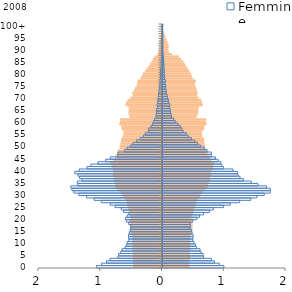
| Category | Italiani | Series 1 | Series 2 | Femmine |
|---|---|---|---|---|
| 0 | -0.46 | 0.434 | -1.063 | 0.994 |
| 1 | -0.463 | 0.436 | -0.978 | 0.919 |
| 2 | -0.464 | 0.436 | -0.899 | 0.842 |
| 3 | -0.471 | 0.447 | -0.842 | 0.792 |
| 4 | -0.471 | 0.446 | -0.714 | 0.666 |
| 5 | -0.466 | 0.442 | -0.703 | 0.658 |
| 6 | -0.468 | 0.443 | -0.668 | 0.625 |
| 7 | -0.477 | 0.45 | -0.65 | 0.607 |
| 8 | -0.472 | 0.448 | -0.598 | 0.554 |
| 9 | -0.472 | 0.445 | -0.572 | 0.533 |
| 10 | -0.47 | 0.445 | -0.565 | 0.511 |
| 11 | -0.474 | 0.448 | -0.536 | 0.492 |
| 12 | -0.473 | 0.447 | -0.539 | 0.491 |
| 13 | -0.478 | 0.452 | -0.543 | 0.497 |
| 14 | -0.49 | 0.465 | -0.53 | 0.478 |
| 15 | -0.51 | 0.485 | -0.514 | 0.472 |
| 16 | -0.51 | 0.483 | -0.504 | 0.447 |
| 17 | -0.514 | 0.488 | -0.504 | 0.451 |
| 18 | -0.507 | 0.483 | -0.54 | 0.445 |
| 19 | -0.515 | 0.487 | -0.581 | 0.492 |
| 20 | -0.497 | 0.471 | -0.59 | 0.558 |
| 21 | -0.501 | 0.477 | -0.565 | 0.602 |
| 22 | -0.517 | 0.496 | -0.538 | 0.665 |
| 23 | -0.524 | 0.503 | -0.622 | 0.76 |
| 24 | -0.537 | 0.514 | -0.659 | 0.822 |
| 25 | -0.553 | 0.533 | -0.761 | 0.99 |
| 26 | -0.557 | 0.539 | -0.84 | 1.096 |
| 27 | -0.569 | 0.55 | -0.985 | 1.249 |
| 28 | -0.588 | 0.571 | -1.101 | 1.431 |
| 29 | -0.622 | 0.605 | -1.223 | 1.527 |
| 30 | -0.647 | 0.628 | -1.346 | 1.649 |
| 31 | -0.682 | 0.66 | -1.428 | 1.747 |
| 32 | -0.72 | 0.696 | -1.459 | 1.747 |
| 33 | -0.754 | 0.73 | -1.477 | 1.684 |
| 34 | -0.751 | 0.738 | -1.364 | 1.546 |
| 35 | -0.758 | 0.752 | -1.371 | 1.438 |
| 36 | -0.773 | 0.773 | -1.295 | 1.31 |
| 37 | -0.765 | 0.768 | -1.335 | 1.256 |
| 38 | -0.789 | 0.796 | -1.36 | 1.222 |
| 39 | -0.777 | 0.788 | -1.413 | 1.214 |
| 40 | -0.786 | 0.798 | -1.339 | 1.142 |
| 41 | -0.81 | 0.822 | -1.216 | 0.989 |
| 42 | -0.812 | 0.823 | -1.152 | 0.963 |
| 43 | -0.829 | 0.836 | -1.039 | 0.944 |
| 44 | -0.78 | 0.79 | -0.912 | 0.9 |
| 45 | -0.756 | 0.767 | -0.836 | 0.858 |
| 46 | -0.747 | 0.758 | -0.716 | 0.793 |
| 47 | -0.722 | 0.735 | -0.713 | 0.791 |
| 48 | -0.711 | 0.72 | -0.605 | 0.722 |
| 49 | -0.679 | 0.692 | -0.568 | 0.676 |
| 50 | -0.675 | 0.689 | -0.506 | 0.612 |
| 51 | -0.666 | 0.683 | -0.469 | 0.566 |
| 52 | -0.658 | 0.676 | -0.411 | 0.524 |
| 53 | -0.65 | 0.672 | -0.354 | 0.467 |
| 54 | -0.626 | 0.643 | -0.301 | 0.417 |
| 55 | -0.619 | 0.642 | -0.271 | 0.384 |
| 56 | -0.621 | 0.646 | -0.22 | 0.335 |
| 57 | -0.647 | 0.673 | -0.215 | 0.316 |
| 58 | -0.653 | 0.679 | -0.178 | 0.287 |
| 59 | -0.683 | 0.715 | -0.154 | 0.248 |
| 60 | -0.67 | 0.702 | -0.139 | 0.213 |
| 61 | -0.671 | 0.709 | -0.118 | 0.182 |
| 62 | -0.519 | 0.552 | -0.097 | 0.146 |
| 63 | -0.531 | 0.571 | -0.096 | 0.14 |
| 64 | -0.535 | 0.583 | -0.089 | 0.131 |
| 65 | -0.53 | 0.583 | -0.089 | 0.125 |
| 66 | -0.533 | 0.592 | -0.074 | 0.113 |
| 67 | -0.583 | 0.653 | -0.08 | 0.12 |
| 68 | -0.572 | 0.645 | -0.069 | 0.1 |
| 69 | -0.551 | 0.629 | -0.067 | 0.094 |
| 70 | -0.504 | 0.586 | -0.063 | 0.083 |
| 71 | -0.469 | 0.559 | -0.057 | 0.074 |
| 72 | -0.473 | 0.573 | -0.052 | 0.064 |
| 73 | -0.451 | 0.558 | -0.047 | 0.057 |
| 74 | -0.43 | 0.544 | -0.04 | 0.051 |
| 75 | -0.403 | 0.529 | -0.037 | 0.051 |
| 76 | -0.393 | 0.529 | -0.031 | 0.041 |
| 77 | -0.39 | 0.542 | -0.034 | 0.046 |
| 78 | -0.341 | 0.489 | -0.026 | 0.034 |
| 79 | -0.318 | 0.475 | -0.025 | 0.032 |
| 80 | -0.301 | 0.458 | -0.026 | 0.032 |
| 81 | -0.268 | 0.433 | -0.021 | 0.027 |
| 82 | -0.243 | 0.411 | -0.019 | 0.027 |
| 83 | -0.209 | 0.385 | -0.013 | 0.023 |
| 84 | -0.183 | 0.362 | -0.012 | 0.022 |
| 85 | -0.161 | 0.338 | -0.012 | 0.021 |
| 86 | -0.14 | 0.303 | -0.01 | 0.018 |
| 87 | -0.115 | 0.266 | -0.009 | 0.017 |
| 88 | -0.067 | 0.156 | -0.006 | 0.01 |
| 89 | -0.042 | 0.104 | -0.005 | 0.008 |
| 90 | -0.037 | 0.094 | -0.003 | 0.006 |
| 91 | -0.037 | 0.099 | -0.003 | 0.005 |
| 92 | -0.036 | 0.099 | -0.003 | 0.006 |
| 93 | -0.029 | 0.081 | -0.003 | 0.005 |
| 94 | -0.022 | 0.064 | -0.003 | 0.004 |
| 95 | -0.016 | 0.05 | -0.002 | 0.004 |
| 96 | -0.01 | 0.035 | -0.001 | 0.003 |
| 97 | -0.007 | 0.025 | -0.001 | 0.003 |
| 98 | -0.004 | 0.016 | -0.001 | 0.002 |
| 99 | -0.002 | 0.01 | -0.001 | 0.001 |
| 100 | -0.004 | 0.015 | -0.003 | 0.005 |